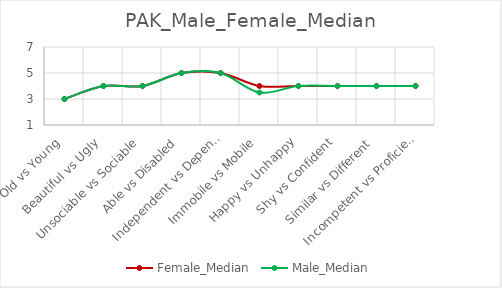
| Category | Female_Median | Male_Median |
|---|---|---|
| Old vs Young | 3 | 3 |
|  Beautiful vs Ugly | 4 | 4 |
| Unsociable vs Sociable | 4 | 4 |
| Able vs Disabled | 5 | 5 |
| Independent vs Dependent | 5 | 5 |
| Immobile vs Mobile | 4 | 3.5 |
| Happy vs Unhappy | 4 | 4 |
| Shy vs Confident | 4 | 4 |
| Similar vs Different | 4 | 4 |
| Incompetent vs Proficient | 4 | 4 |